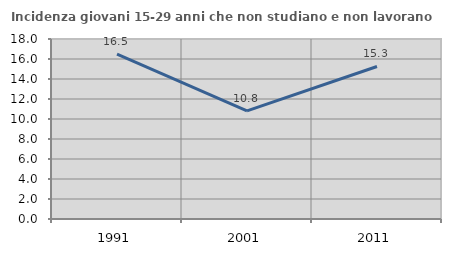
| Category | Incidenza giovani 15-29 anni che non studiano e non lavorano  |
|---|---|
| 1991.0 | 16.476 |
| 2001.0 | 10.818 |
| 2011.0 | 15.253 |